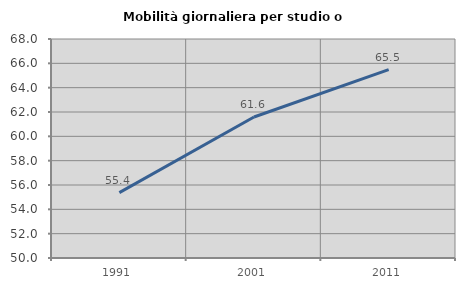
| Category | Mobilità giornaliera per studio o lavoro |
|---|---|
| 1991.0 | 55.377 |
| 2001.0 | 61.589 |
| 2011.0 | 65.482 |